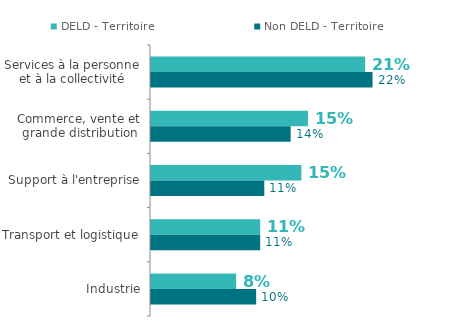
| Category | DELD - Territoire | Non DELD - Territoire |
|---|---|---|
| Services à la personne et à la collectivité | 0.209 | 0.216 |
| Commerce, vente et grande distribution | 0.153 | 0.136 |
| Support à l'entreprise | 0.147 | 0.111 |
| Transport et logistique | 0.107 | 0.107 |
| Industrie | 0.083 | 0.103 |